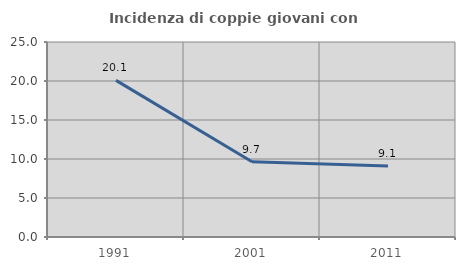
| Category | Incidenza di coppie giovani con figli |
|---|---|
| 1991.0 | 20.083 |
| 2001.0 | 9.653 |
| 2011.0 | 9.114 |